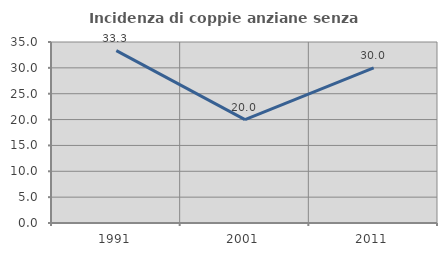
| Category | Incidenza di coppie anziane senza figli  |
|---|---|
| 1991.0 | 33.333 |
| 2001.0 | 20 |
| 2011.0 | 30 |